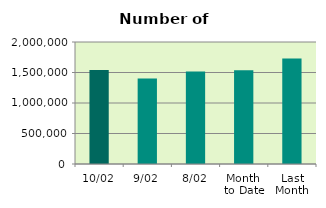
| Category | Series 0 |
|---|---|
| 10/02 | 1539224 |
| 9/02 | 1400296 |
| 8/02 | 1517386 |
| Month 
to Date | 1535779.75 |
| Last
Month | 1728874.4 |